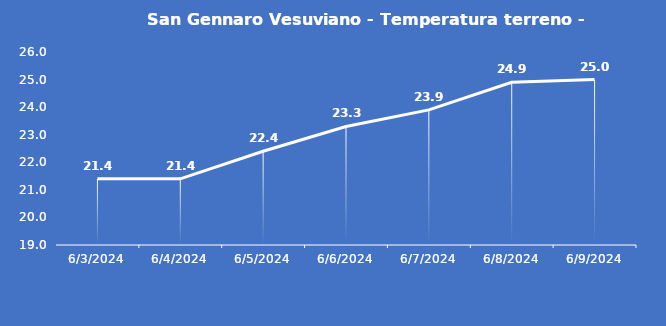
| Category | San Gennaro Vesuviano - Temperatura terreno - Grezzo (°C) |
|---|---|
| 6/3/24 | 21.4 |
| 6/4/24 | 21.4 |
| 6/5/24 | 22.4 |
| 6/6/24 | 23.3 |
| 6/7/24 | 23.9 |
| 6/8/24 | 24.9 |
| 6/9/24 | 25 |